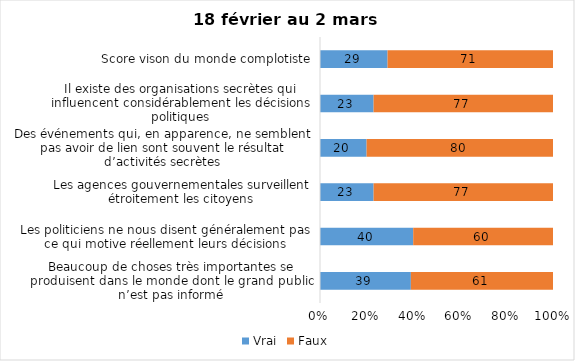
| Category | Vrai | Faux |
|---|---|---|
| Beaucoup de choses très importantes se produisent dans le monde dont le grand public n’est pas informé | 39 | 61 |
| Les politiciens ne nous disent généralement pas ce qui motive réellement leurs décisions | 40 | 60 |
| Les agences gouvernementales surveillent étroitement les citoyens | 23 | 77 |
| Des événements qui, en apparence, ne semblent pas avoir de lien sont souvent le résultat d’activités secrètes | 20 | 80 |
| Il existe des organisations secrètes qui influencent considérablement les décisions politiques | 23 | 77 |
| Score vison du monde complotiste | 29 | 71 |